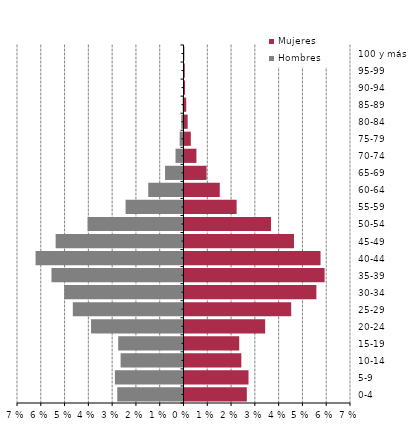
| Category | Hombres | Mujeres |
|---|---|---|
| 0-4 | -0.028 | 0.026 |
| 5-9 | -0.029 | 0.027 |
| 10-14 | -0.026 | 0.024 |
| 15-19 | -0.027 | 0.023 |
| 20-24 | -0.039 | 0.034 |
| 25-29 | -0.047 | 0.045 |
| 30-34 | -0.05 | 0.055 |
| 35-39 | -0.056 | 0.059 |
| 40-44 | -0.062 | 0.057 |
| 45-49 | -0.054 | 0.046 |
| 50-54 | -0.04 | 0.036 |
| 55-59 | -0.024 | 0.022 |
| 60-64 | -0.015 | 0.015 |
| 65-69 | -0.008 | 0.009 |
| 70-74 | -0.003 | 0.005 |
| 75-79 | -0.002 | 0.003 |
| 80-84 | -0.001 | 0.001 |
| 85-89 | 0 | 0.001 |
| 90-94 | 0 | 0 |
| 95-99 | 0 | 0 |
| 100 y más | 0 | 0 |